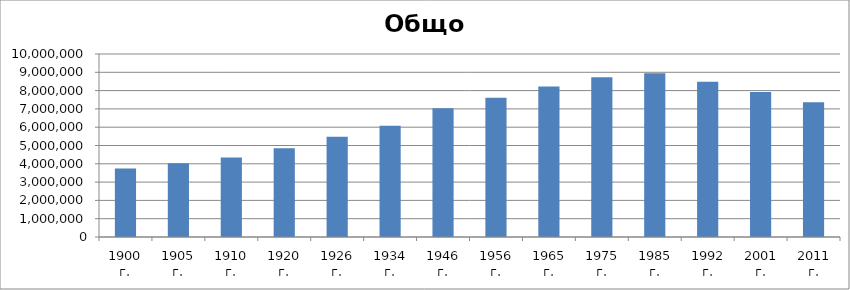
| Category | Общо |
|---|---|
| 1900 г. | 3744283 |
| 1905 г. | 4035575 |
| 1910 г. | 4337513 |
| 1920 г. | 4846971 |
| 1926 г. | 5478741 |
| 1934 г. | 6077939 |
| 1946 г. | 7029349 |
| 1956 г. | 7613709 |
| 1965 г. | 8227866 |
| 1975 г. | 8727771 |
| 1985 г. | 8948649 |
| 1992 г. | 8487317 |
| 2001 г. | 7928901 |
| 2011 г. | 7364570 |